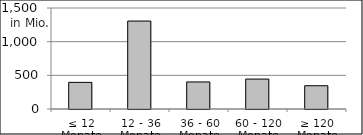
| Category | Volumen |
|---|---|
| ≤ 12 Monate | 395462036.4 |
| 12 - 36 Monate | 1306044539.79 |
| 36 - 60 Monate | 401652175.36 |
| 60 - 120 Monate | 444414105.92 |
| ≥ 120 Monate | 345585810.771 |